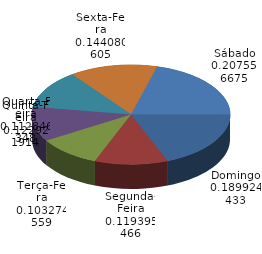
| Category | Qtde Vítimas |
|---|---|
| Domingo | 377 |
| Segunda-Feira | 237 |
| Terça-Feira | 205 |
| Quarta-Feira | 224 |
| Quinta-Feira | 244 |
| Sexta-Feira | 286 |
| Sábado | 412 |